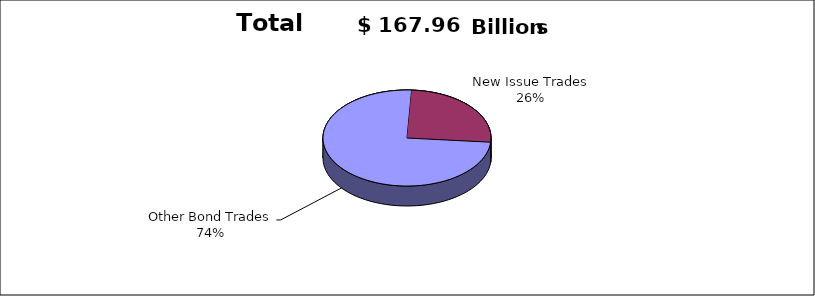
| Category | Series 0 |
|---|---|
| Other Bond Trades | 125109917261 |
| New Issue Trades | 42853250178 |